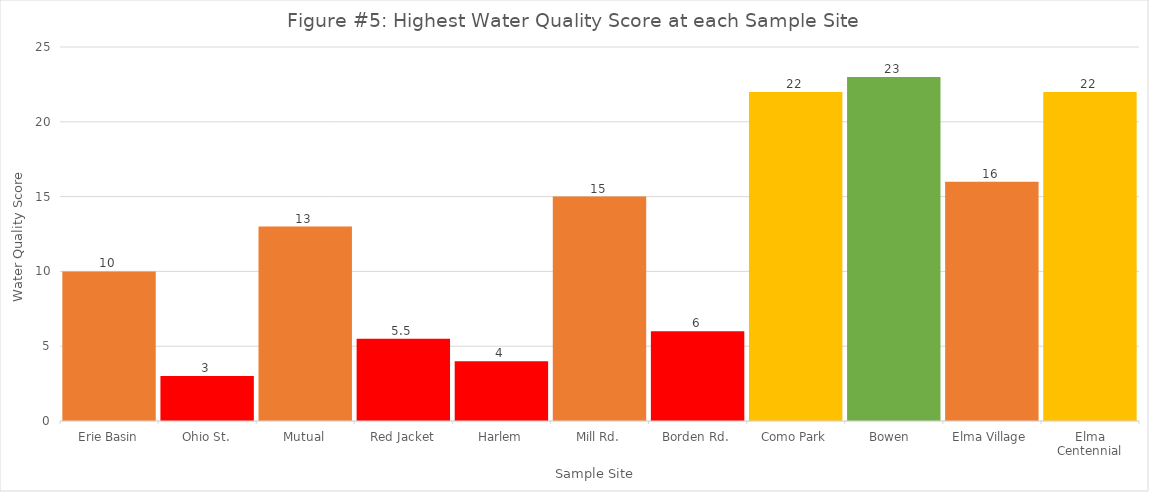
| Category | Series 0 |
|---|---|
| Erie Basin | 10 |
| Ohio St. | 3 |
| Mutual | 13 |
| Red Jacket | 5.5 |
| Harlem | 4 |
| Mill Rd. | 15 |
| Borden Rd. | 6 |
| Como Park | 22 |
| Bowen  | 23 |
| Elma Village | 16 |
| Elma Centennial | 22 |